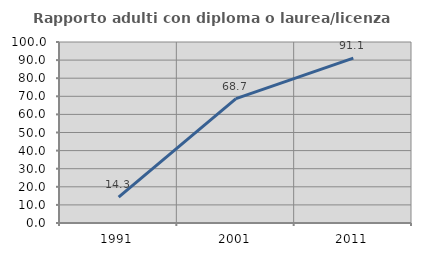
| Category | Rapporto adulti con diploma o laurea/licenza media  |
|---|---|
| 1991.0 | 14.33 |
| 2001.0 | 68.681 |
| 2011.0 | 91.08 |